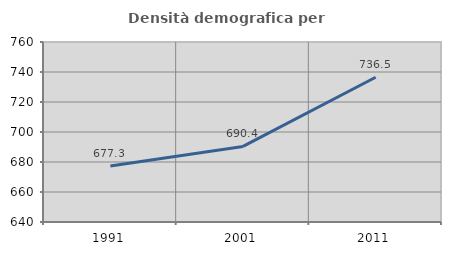
| Category | Densità demografica |
|---|---|
| 1991.0 | 677.342 |
| 2001.0 | 690.376 |
| 2011.0 | 736.519 |